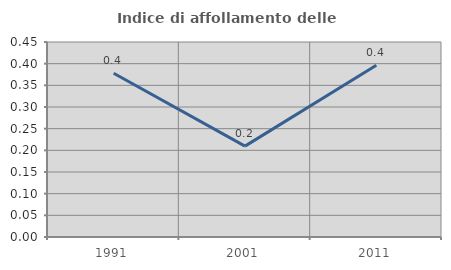
| Category | Indice di affollamento delle abitazioni  |
|---|---|
| 1991.0 | 0.378 |
| 2001.0 | 0.21 |
| 2011.0 | 0.396 |